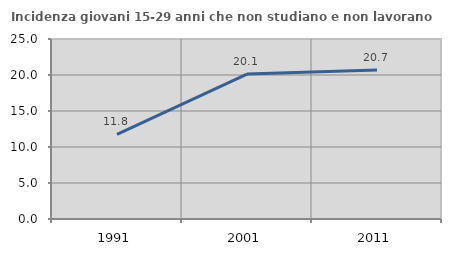
| Category | Incidenza giovani 15-29 anni che non studiano e non lavorano  |
|---|---|
| 1991.0 | 11.765 |
| 2001.0 | 20.13 |
| 2011.0 | 20.702 |